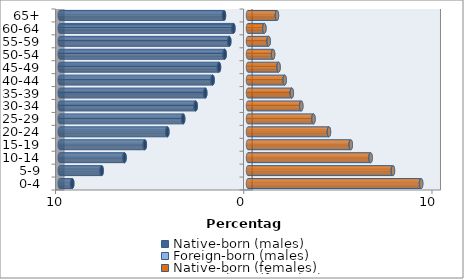
| Category | Native-born (males) | Foreign-born (males) | Native-born (females) | Foreign-born (females) |
|---|---|---|---|---|
| 0-4 | -9.336 | -0.014 | 9.189 | 0.015 |
| 5-9 | -7.773 | -0.012 | 7.69 | 0.014 |
| 10-14 | -6.559 | -0.009 | 6.507 | 0.01 |
| 15-19 | -5.48 | -0.008 | 5.454 | 0.009 |
| 20-24 | -4.282 | -0.008 | 4.296 | 0.008 |
| 25-29 | -3.442 | -0.01 | 3.473 | 0.01 |
| 30-34 | -2.778 | -0.012 | 2.824 | 0.01 |
| 35-39 | -2.269 | -0.013 | 2.323 | 0.008 |
| 40-44 | -1.878 | -0.012 | 1.943 | 0.007 |
| 45-49 | -1.54 | -0.01 | 1.619 | 0.005 |
| 50-54 | -1.238 | -0.008 | 1.331 | 0.004 |
| 55-59 | -0.993 | -0.005 | 1.094 | 0.003 |
| 60-64 | -0.774 | -0.003 | 0.868 | 0.002 |
| 65+ | -1.276 | -0.003 | 1.536 | 0.002 |